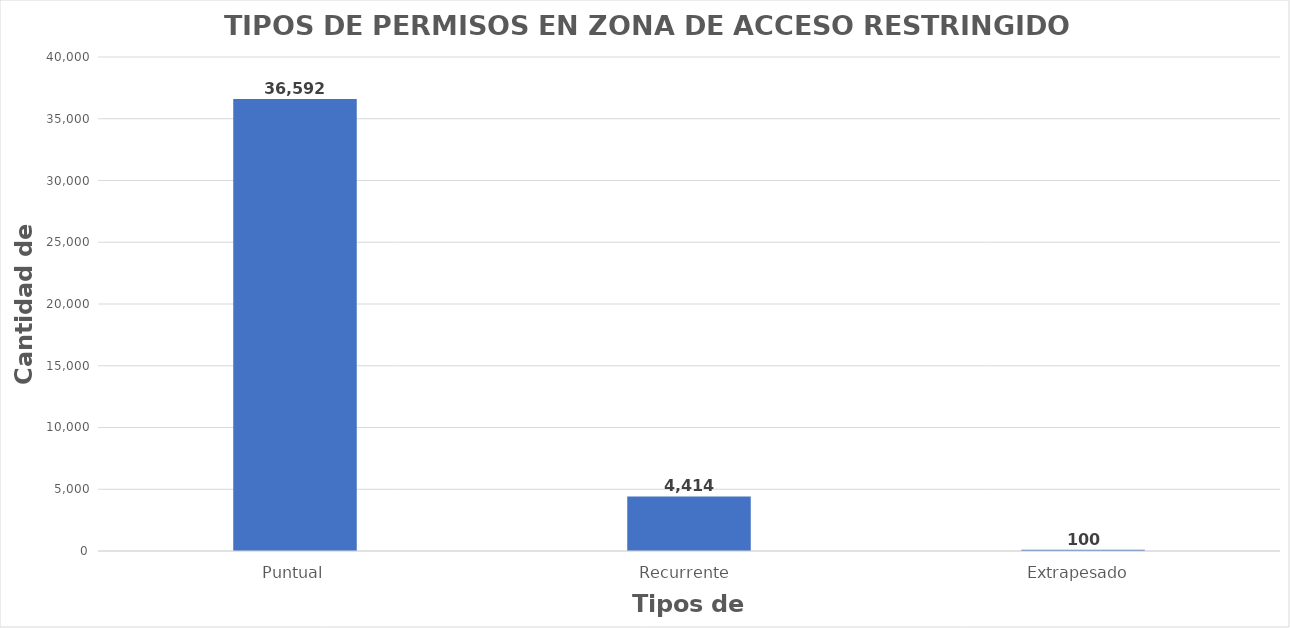
| Category | Series 0 |
|---|---|
| Puntual | 36592 |
| Recurrente  | 4414 |
| Extrapesado  | 100 |